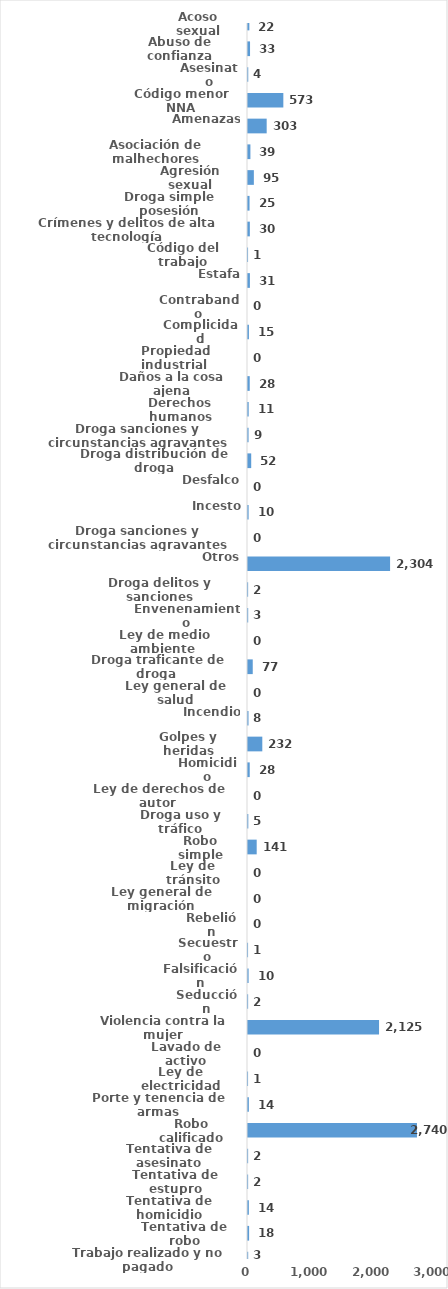
| Category | Series 0 |
|---|---|
| Acoso sexual | 22 |
| Abuso de confianza | 33 |
| Asesinato | 4 |
| Código menor NNA | 573 |
| Amenazas | 303 |
| Asociación de malhechores | 39 |
| Agresión sexual | 95 |
| Droga simple posesión | 25 |
| Crímenes y delitos de alta tecnología | 30 |
| Código del trabajo | 1 |
| Estafa | 31 |
| Contrabando | 0 |
| Complicidad | 15 |
| Propiedad industrial  | 0 |
| Daños a la cosa ajena | 28 |
| Derechos humanos | 11 |
| Droga sanciones y circunstancias agravantes | 9 |
| Droga distribución de droga | 52 |
| Desfalco | 0 |
| Incesto | 10 |
| Droga sanciones y circunstancias agravantes | 0 |
| Otros | 2304 |
| Droga delitos y sanciones | 2 |
| Envenenamiento | 3 |
| Ley de medio ambiente  | 0 |
| Droga traficante de droga  | 77 |
| Ley general de salud | 0 |
| Incendio | 8 |
| Golpes y heridas | 232 |
| Homicidio | 28 |
| Ley de derechos de autor  | 0 |
| Droga uso y tráfico | 5 |
| Robo simple | 141 |
| Ley de tránsito | 0 |
| Ley general de migración | 0 |
| Rebelión | 0 |
| Secuestro | 1 |
| Falsificación | 10 |
| Seducción | 2 |
| Violencia contra la mujer | 2125 |
| Lavado de activo | 0 |
| Ley de electricidad | 1 |
| Porte y tenencia de armas | 14 |
| Robo calificado | 2740 |
| Tentativa de asesinato | 2 |
| Tentativa de estupro | 2 |
| Tentativa de homicidio | 14 |
| Tentativa de robo | 18 |
| Trabajo realizado y no pagado | 3 |